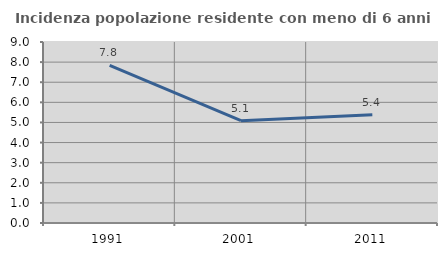
| Category | Incidenza popolazione residente con meno di 6 anni |
|---|---|
| 1991.0 | 7.842 |
| 2001.0 | 5.089 |
| 2011.0 | 5.383 |